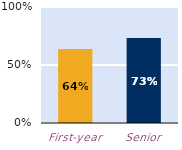
| Category | At least some |
|---|---|
| First-year | 0.639 |
| Senior | 0.733 |